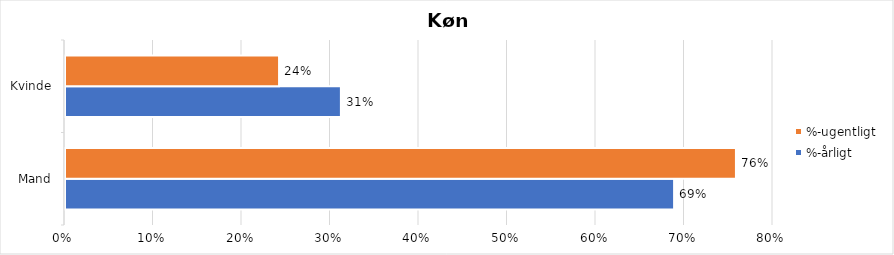
| Category | %-årligt | %-ugentligt |
|---|---|---|
| Mand | 0.688 | 0.758 |
| Kvinde | 0.312 | 0.242 |